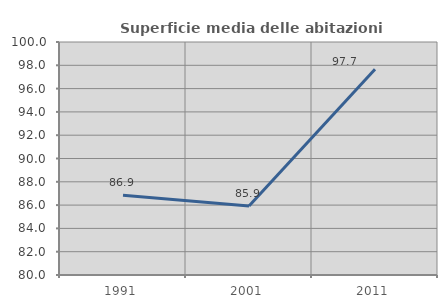
| Category | Superficie media delle abitazioni occupate |
|---|---|
| 1991.0 | 86.852 |
| 2001.0 | 85.913 |
| 2011.0 | 97.656 |